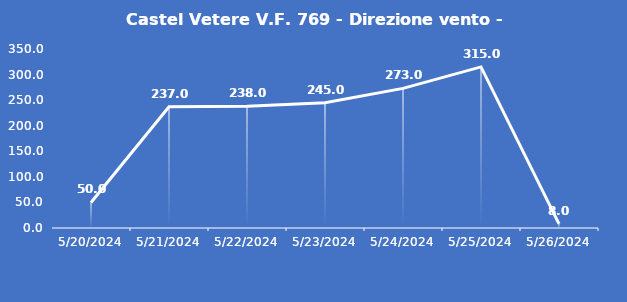
| Category | Castel Vetere V.F. 769 - Direzione vento - Grezzo (°N) |
|---|---|
| 5/20/24 | 50 |
| 5/21/24 | 237 |
| 5/22/24 | 238 |
| 5/23/24 | 245 |
| 5/24/24 | 273 |
| 5/25/24 | 315 |
| 5/26/24 | 8 |